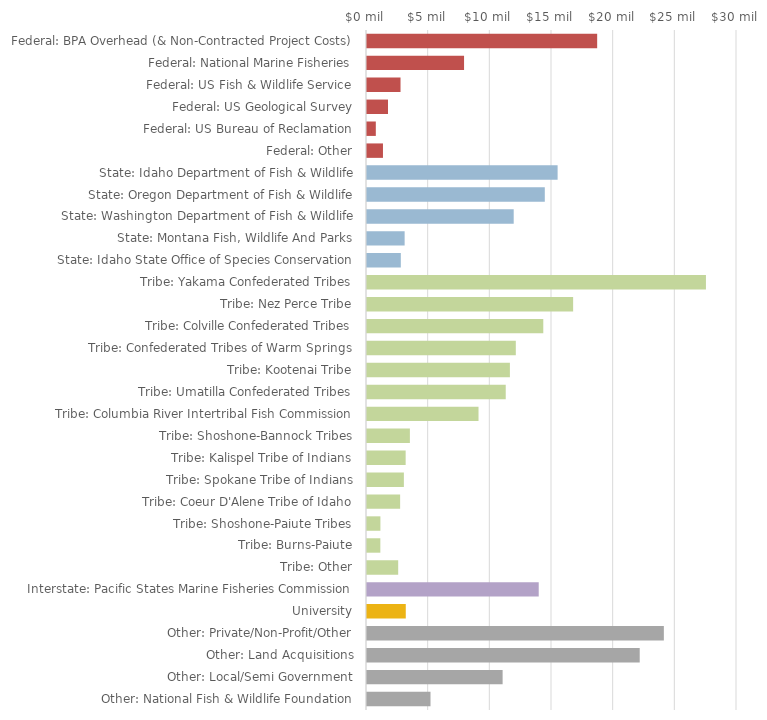
| Category | Series 0 | Series 1 |
|---|---|---|
| Federal: BPA Overhead (& Non-Contracted Project Costs) |  | 18662085.17 |
| Federal: National Marine Fisheries |  | 7869433 |
| Federal: US Fish & Wildlife Service |  | 2718120.18 |
| Federal: US Geological Survey |  | 1705065.54 |
| Federal: US Bureau of Reclamation |  | 714662.68 |
| Federal: Other |  | 1294719 |
| State: Idaho Department of Fish & Wildlife |  | 15455053.79 |
| State: Oregon Department of Fish & Wildlife |  | 14416087.09 |
| State: Washington Department of Fish & Wildlife |  | 11894739.43 |
| State: Montana Fish, Wildlife And Parks |  | 3051536.75 |
| State: Idaho State Office of Species Conservation |  | 2742180.2 |
| Tribe: Yakama Confederated Tribes |  | 27481990.55 |
| Tribe: Nez Perce Tribe |  | 16713068.2 |
| Tribe: Colville Confederated Tribes |  | 14293923.97 |
| Tribe: Confederated Tribes of Warm Springs |  | 12065436.45 |
| Tribe: Kootenai Tribe |  | 11586883.73 |
| Tribe: Umatilla Confederated Tribes |  | 11248947.37 |
| Tribe: Columbia River Intertribal Fish Commission |  | 9041925.84 |
| Tribe: Shoshone-Bannock Tribes |  | 3477187.41 |
| Tribe: Kalispel Tribe of Indians |  | 3133721.78 |
| Tribe: Spokane Tribe of Indians |  | 2989703.16 |
| Tribe: Coeur D'Alene Tribe of Idaho |  | 2686195.65 |
| Tribe: Shoshone-Paiute Tribes |  | 1086909.66 |
| Tribe: Burns-Paiute |  | 1081654.73 |
| Tribe: Other |  | 2528557 |
| Interstate: Pacific States Marine Fisheries Commission |  | 13923765.53 |
| University |  | 3143475.74 |
| Other: Private/Non-Profit/Other |  | 24068856.09 |
| Other: Land Acquisitions |  | 22112085.41 |
| Other: Local/Semi Government |  | 10995773.41 |
| Other: National Fish & Wildlife Foundation |  | 5148896.25 |